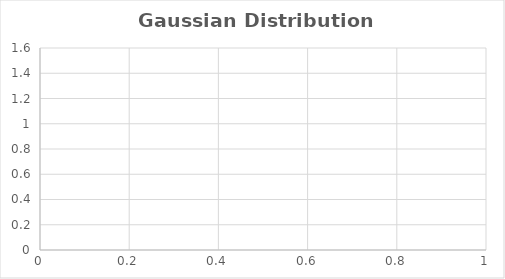
| Category | Series 0 |
|---|---|
| 0 | 0.407 |
| 1 | 0.661 |
| 2 | 0.951 |
| 3 | 1.212 |
| 4 | 1.368 |
| 5 | 1.368 |
| 6 | 1.212 |
| 7 | 0.951 |
| 8 | 0.661 |
| 9 | 0.407 |